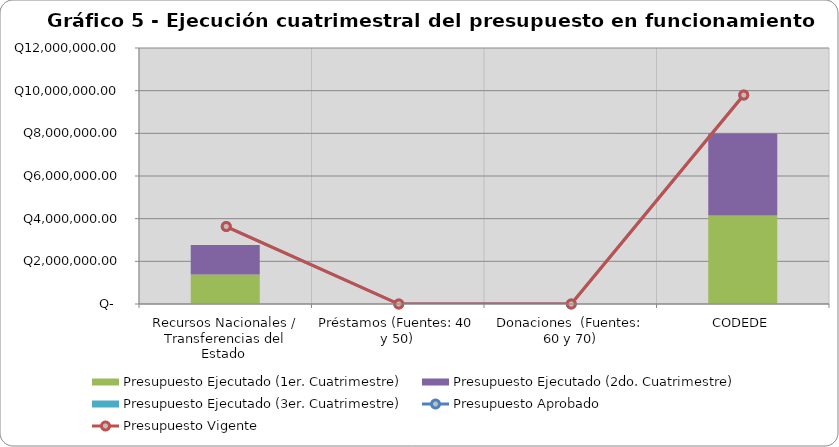
| Category | Presupuesto Ejecutado (1er. Cuatrimestre) | Presupuesto Ejecutado (2do. Cuatrimestre) | Presupuesto Ejecutado (3er. Cuatrimestre) |
|---|---|---|---|
| Recursos Nacionales / Transferencias del Estado  | 1377507.16 | 1391779.77 | 0 |
| Préstamos (Fuentes: 40 y 50) | 0 | 0 | 0 |
| Donaciones  (Fuentes: 60 y 70) | 0 | 0 | 0 |
| CODEDE | 4144711.38 | 3850230.84 | 0 |